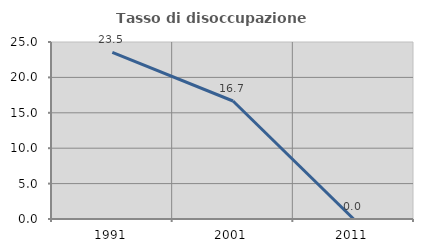
| Category | Tasso di disoccupazione giovanile  |
|---|---|
| 1991.0 | 23.529 |
| 2001.0 | 16.667 |
| 2011.0 | 0 |